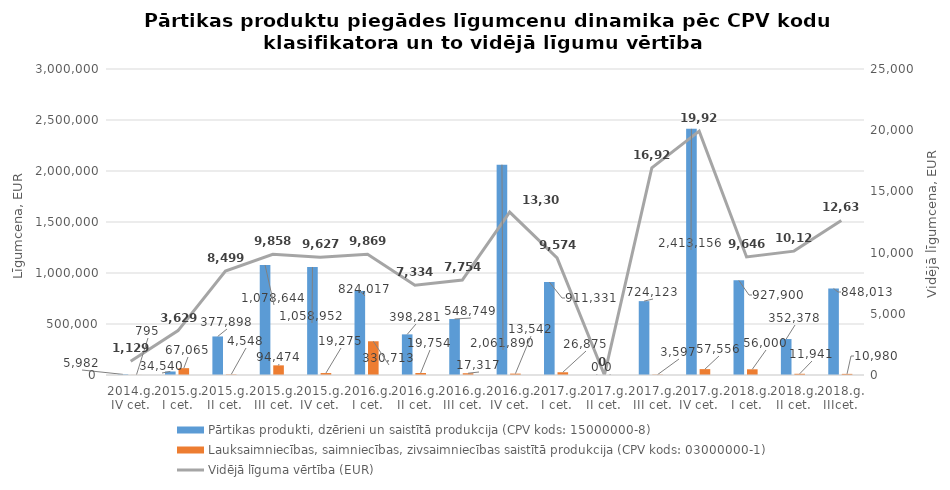
| Category | Pārtikas produkti, dzērieni un saistītā produkcija (CPV kods: 15000000-8) | Lauksaimniecības, saimniecības, zivsaimniecības saistītā produkcija (CPV kods: 03000000-1) |
|---|---|---|
| 2014.g. IV cet. | 5982 | 795 |
| 2015.g. I cet. | 34540 | 67065 |
| 2015.g. II cet. | 377898 | 4548 |
| 2015.g. III cet. | 1078644 | 94474 |
| 2015.g. IV cet. | 1058952 | 19275 |
| 2016.g. I cet. | 824017 | 330713 |
| 2016.g. II cet. | 398281 | 19754 |
| 2016.g. III cet. | 548749.01 | 17317 |
| 2016.g. IV cet. | 2061890 | 13542 |
| 2017.g. I cet. | 911330.81 | 26874.91 |
| 2017.g. II cet. | 0 | 0 |
| 2017.g. III cet. | 724123.07 | 3596.6 |
| 2017.g. IV cet. | 2413156 | 57556 |
| 2018.g. I cet. | 927900 | 56000 |
| 2018.g. II cet. | 352378 | 11941 |
| 2018.g. IIIcet. | 848013 | 10980 |